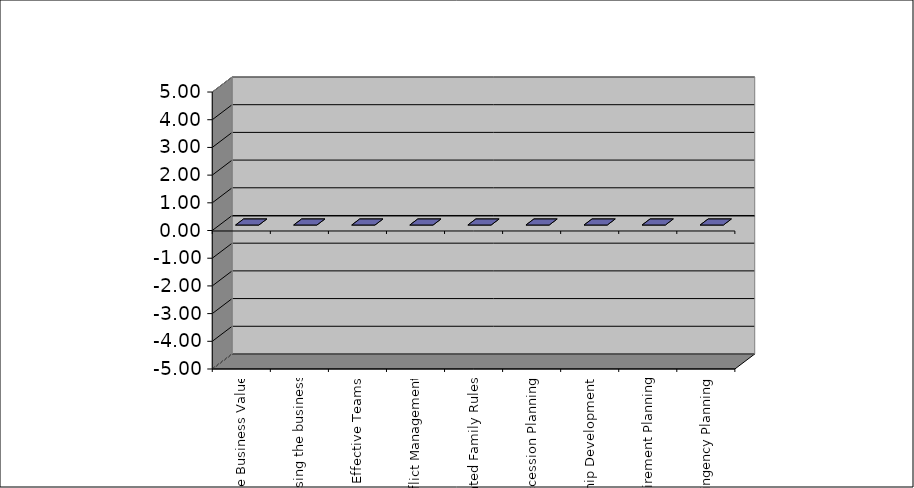
| Category | Series 0 |
|---|---|
| Maximise Business Value | 0 |
| Professionalising the business | 0 |
| Effective Teams | 0 |
| Communication & Conflict Management | 0 |
| Documented Family Rules | 0 |
| Succession Planning | 0 |
| Leadership Development | 0 |
| Personal Retirement Planning | 0 |
| Contingency Planning | 0 |